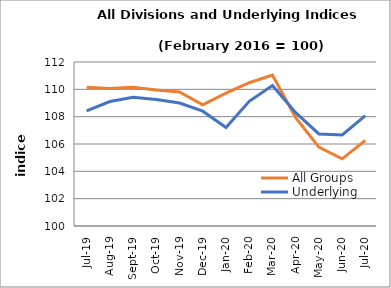
| Category | All Groups | Underlying |
|---|---|---|
| 2019-07-01 | 110.146 | 108.423 |
| 2019-08-01 | 110.057 | 109.11 |
| 2019-09-01 | 110.148 | 109.423 |
| 2019-10-01 | 109.943 | 109.256 |
| 2019-11-01 | 109.811 | 108.998 |
| 2019-12-01 | 108.864 | 108.4 |
| 2020-01-01 | 109.718 | 107.211 |
| 2020-02-01 | 110.483 | 109.121 |
| 2020-03-01 | 111.043 | 110.276 |
| 2020-04-01 | 107.93 | 108.297 |
| 2020-05-01 | 105.77 | 106.735 |
| 2020-06-01 | 104.913 | 106.661 |
| 2020-07-01 | 106.265 | 108.077 |